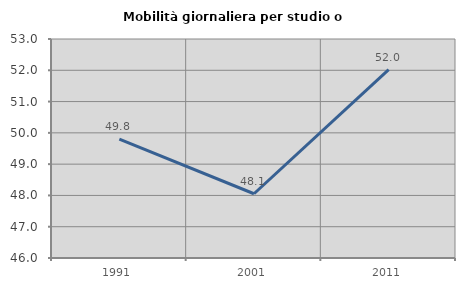
| Category | Mobilità giornaliera per studio o lavoro |
|---|---|
| 1991.0 | 49.797 |
| 2001.0 | 48.054 |
| 2011.0 | 52.024 |